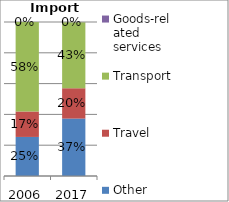
| Category | Other commercial services | Travel | Transport | Goods-related services |
|---|---|---|---|---|
| 2006.0 | 0.254 | 0.165 | 0.581 | 0 |
| 2017.0 | 0.373 | 0.197 | 0.429 | 0.001 |